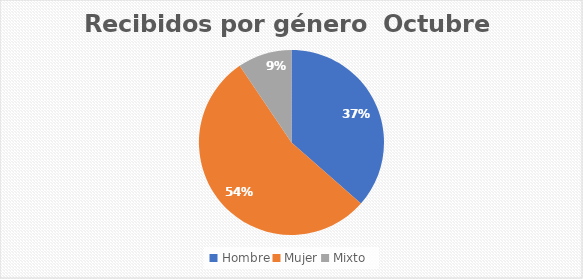
| Category | Recibidos por género  Octubre |
|---|---|
| Hombre | 27 |
| Mujer | 40 |
| Mixto | 7 |